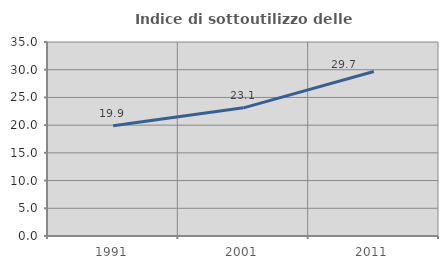
| Category | Indice di sottoutilizzo delle abitazioni  |
|---|---|
| 1991.0 | 19.872 |
| 2001.0 | 23.118 |
| 2011.0 | 29.67 |